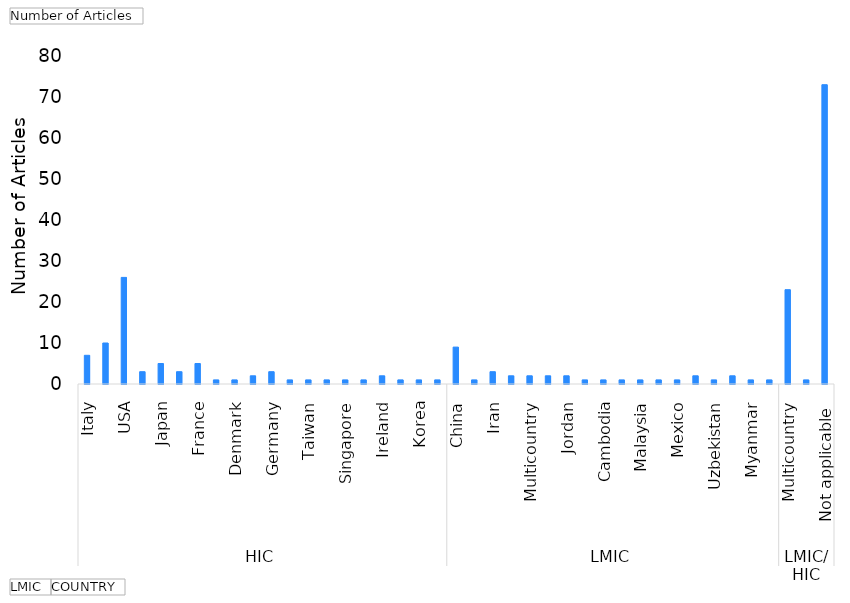
| Category | Total |
|---|---|
| 0 | 7 |
| 1 | 10 |
| 2 | 26 |
| 3 | 3 |
| 4 | 5 |
| 5 | 3 |
| 6 | 5 |
| 7 | 1 |
| 8 | 1 |
| 9 | 2 |
| 10 | 3 |
| 11 | 1 |
| 12 | 1 |
| 13 | 1 |
| 14 | 1 |
| 15 | 1 |
| 16 | 2 |
| 17 | 1 |
| 18 | 1 |
| 19 | 1 |
| 20 | 9 |
| 21 | 1 |
| 22 | 3 |
| 23 | 2 |
| 24 | 2 |
| 25 | 2 |
| 26 | 2 |
| 27 | 1 |
| 28 | 1 |
| 29 | 1 |
| 30 | 1 |
| 31 | 1 |
| 32 | 1 |
| 33 | 2 |
| 34 | 1 |
| 35 | 2 |
| 36 | 1 |
| 37 | 1 |
| 38 | 23 |
| 39 | 1 |
| 40 | 73 |